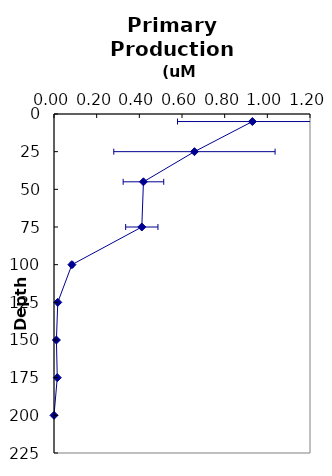
| Category | Series 0 |
|---|---|
| 0.929874846871569 | 5 |
| 0.658244391237902 | 25 |
| 0.419250725735289 | 45 |
| 0.411588960846097 | 75 |
| 0.0839201246911538 | 100 |
| 0.0177054395851776 | 125 |
| 0.0113324281199405 | 150 |
| 0.0153319466390706 | 175 |
| 0.0 | 200 |